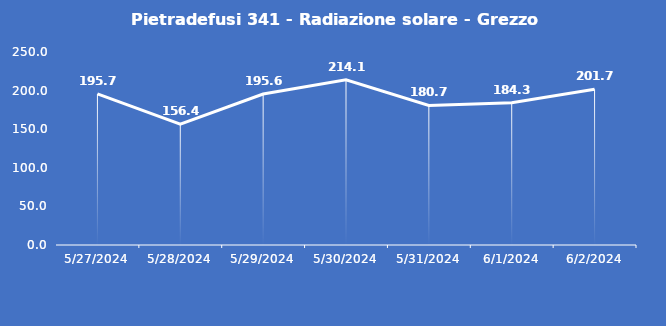
| Category | Pietradefusi 341 - Radiazione solare - Grezzo (W/m2) |
|---|---|
| 5/27/24 | 195.7 |
| 5/28/24 | 156.4 |
| 5/29/24 | 195.6 |
| 5/30/24 | 214.1 |
| 5/31/24 | 180.7 |
| 6/1/24 | 184.3 |
| 6/2/24 | 201.7 |